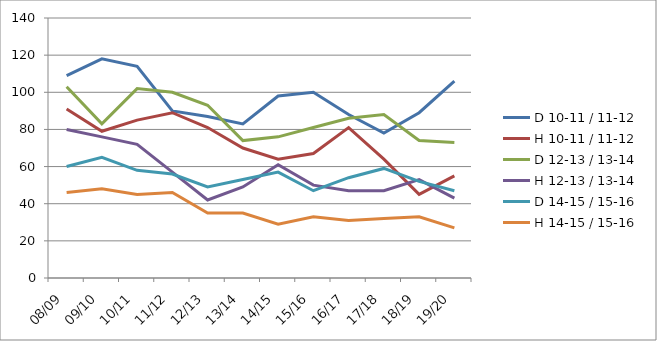
| Category | D 10-11 / 11-12 | H 10-11 / 11-12 | D 12-13 / 13-14 | H 12-13 / 13-14 | D 14-15 / 15-16 | H 14-15 / 15-16 |
|---|---|---|---|---|---|---|
| 08/09 | 109 | 91 | 103 | 80 | 60 | 46 |
| 09/10 | 118 | 79 | 83 | 76 | 65 | 48 |
| 10/11 | 114 | 85 | 102 | 72 | 58 | 45 |
| 11/12 | 90 | 89 | 100 | 57 | 56 | 46 |
| 12/13 | 87 | 81 | 93 | 42 | 49 | 35 |
| 13/14 | 83 | 70 | 74 | 49 | 53 | 35 |
| 14/15 | 98 | 64 | 76 | 61 | 57 | 29 |
| 15/16 | 100 | 67 | 81 | 50 | 47 | 33 |
| 16/17 | 88 | 81 | 86 | 47 | 54 | 31 |
| 17/18 | 78 | 64 | 88 | 47 | 59 | 32 |
| 18/19 | 89 | 45 | 74 | 53 | 52 | 33 |
| 19/20 | 106 | 55 | 73 | 43 | 47 | 27 |